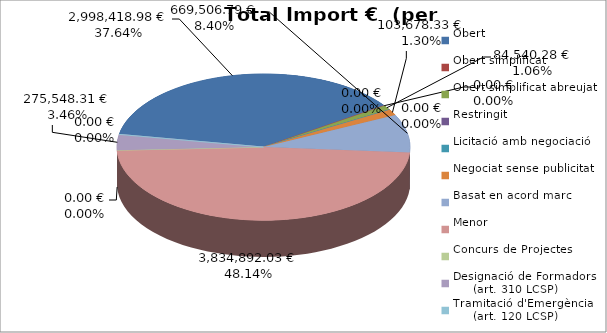
| Category | Total preu
(amb IVA) |
|---|---|
| Obert | 2998418.98 |
| Obert simplificat | 0 |
| Obert simplificat abreujat | 84540.28 |
| Restringit | 0 |
| Licitació amb negociació | 0 |
| Negociat sense publicitat | 103678.33 |
| Basat en acord marc | 669506.79 |
| Menor | 3834892.03 |
| Concurs de Projectes | 0 |
| Designació de Formadors
     (art. 310 LCSP) | 275548.31 |
| Tramitació d'Emergència
     (art. 120 LCSP) | 0 |